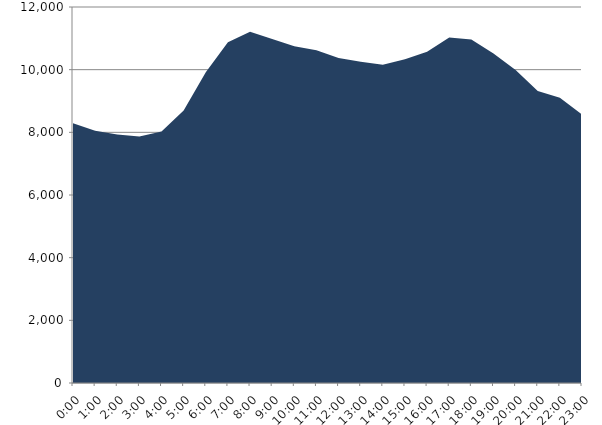
| Category | Series 0 | Series 1 |
|---|---|---|
| 2022-01-19 |  | 8289.891 |
| 2022-01-19 01:00:00 |  | 8047.298 |
| 2022-01-19 02:00:00 |  | 7930.867 |
| 2022-01-19 03:00:00 |  | 7864.92 |
| 2022-01-19 04:00:00 |  | 8025.472 |
| 2022-01-19 05:00:00 |  | 8692.884 |
| 2022-01-19 06:00:00 |  | 9917.927 |
| 2022-01-19 07:00:00 |  | 10871.509 |
| 2022-01-19 08:00:00 |  | 11208.466 |
| 2022-01-19 09:00:00 |  | 10980.932 |
| 2022-01-19 10:00:00 |  | 10744.024 |
| 2022-01-19 11:00:00 |  | 10618.9 |
| 2022-01-19 12:00:00 |  | 10375.983 |
| 2022-01-19 13:00:00 |  | 10256.565 |
| 2022-01-19 14:00:00 |  | 10156.809 |
| 2022-01-19 15:00:00 |  | 10331.096 |
| 2022-01-19 16:00:00 |  | 10572.373 |
| 2022-01-19 17:00:00 |  | 11027.024 |
| 2022-01-19 18:00:00 |  | 10958.856 |
| 2022-01-19 19:00:00 |  | 10517.937 |
| 2022-01-19 20:00:00 |  | 9988.193 |
| 2022-01-19 21:00:00 |  | 9316.583 |
| 2022-01-19 22:00:00 |  | 9102.085 |
| 2022-01-19 23:00:00 |  | 8565.933 |